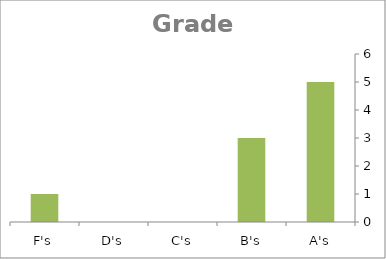
| Category | Series 0 |
|---|---|
| A's | 5 |
| B's | 3 |
| C's | 0 |
| D's | 0 |
| F's | 1 |